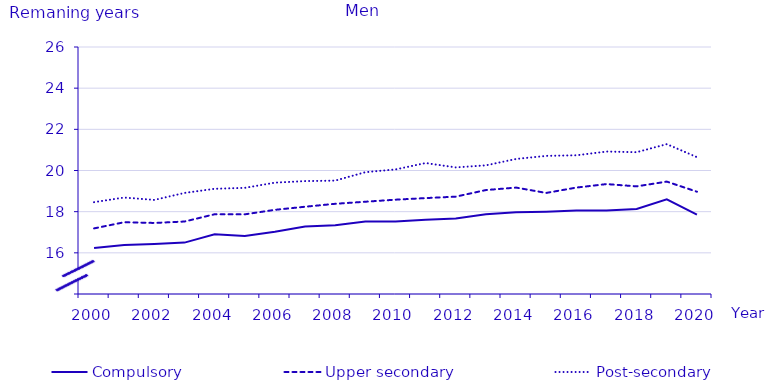
| Category | Compulsory | Upper secondary | Post-secondary |
|---|---|---|---|
| 2000.0 | 16.235 | 17.187 | 18.462 |
| 2001.0 | 16.382 | 17.487 | 18.686 |
| 2002.0 | 16.431 | 17.452 | 18.571 |
| 2003.0 | 16.497 | 17.521 | 18.91 |
| 2004.0 | 16.902 | 17.875 | 19.111 |
| 2005.0 | 16.817 | 17.87 | 19.157 |
| 2006.0 | 17.022 | 18.089 | 19.41 |
| 2007.0 | 17.28 | 18.24 | 19.485 |
| 2008.0 | 17.342 | 18.382 | 19.509 |
| 2009.0 | 17.518 | 18.483 | 19.918 |
| 2010.0 | 17.52 | 18.583 | 20.052 |
| 2011.0 | 17.607 | 18.659 | 20.362 |
| 2012.0 | 17.67 | 18.73 | 20.15 |
| 2013.0 | 17.88 | 19.05 | 20.25 |
| 2014.0 | 17.97 | 19.17 | 20.56 |
| 2015.0 | 18 | 18.91 | 20.71 |
| 2016.0 | 18.06 | 19.17 | 20.74 |
| 2017.0 | 18.06 | 19.34 | 20.92 |
| 2018.0 | 18.13 | 19.23 | 20.89 |
| 2019.0 | 18.6 | 19.46 | 21.28 |
| 2020.0 | 17.86 | 18.97 | 20.65 |